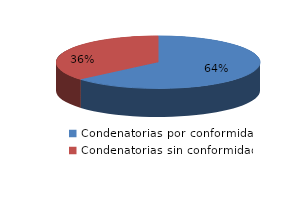
| Category | Series 0 |
|---|---|
| 0 | 7 |
| 1 | 4 |